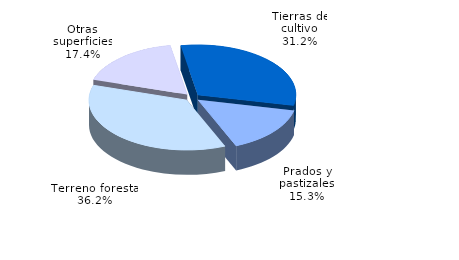
| Category | Series 0 |
|---|---|
| Tierras de cultivo | 157.683 |
| Prados y pastizales | 77.112 |
| Terreno forestal | 182.915 |
| Otras superficies | 87.925 |